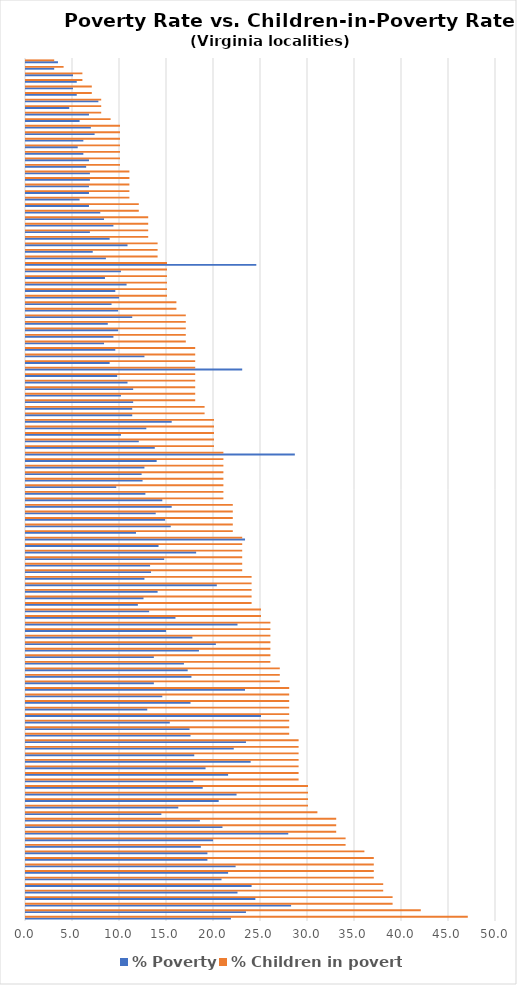
| Category | % Poverty | % Children in poverty |
|---|---|---|
| 0 | 21.8 | 47 |
| 1 | 23.4 | 42 |
| 2 | 28.2 | 39 |
| 3 | 24.4 | 39 |
| 4 | 22.5 | 38 |
| 5 | 24 | 38 |
| 6 | 20.8 | 37 |
| 7 | 21.5 | 37 |
| 8 | 22.3 | 37 |
| 9 | 19.3 | 37 |
| 10 | 19.3 | 36 |
| 11 | 18.6 | 34 |
| 12 | 19.9 | 34 |
| 13 | 27.9 | 33 |
| 14 | 20.9 | 33 |
| 15 | 18.5 | 33 |
| 16 | 14.4 | 31 |
| 17 | 16.2 | 30 |
| 18 | 20.5 | 30 |
| 19 | 22.4 | 30 |
| 20 | 18.8 | 30 |
| 21 | 17.8 | 29 |
| 22 | 21.5 | 29 |
| 23 | 19.1 | 29 |
| 24 | 23.9 | 29 |
| 25 | 17.9 | 29 |
| 26 | 22.1 | 29 |
| 27 | 23.4 | 29 |
| 28 | 17.5 | 28 |
| 29 | 17.4 | 28 |
| 30 | 15.3 | 28 |
| 31 | 25 | 28 |
| 32 | 12.9 | 28 |
| 33 | 17.5 | 28 |
| 34 | 14.5 | 28 |
| 35 | 23.3 | 28 |
| 36 | 13.6 | 27 |
| 37 | 17.6 | 27 |
| 38 | 17.2 | 27 |
| 39 | 16.8 | 26 |
| 40 | 13.6 | 26 |
| 41 | 18.4 | 26 |
| 42 | 20.2 | 26 |
| 43 | 17.7 | 26 |
| 44 | 14.9 | 26 |
| 45 | 22.5 | 26 |
| 46 | 15.9 | 25 |
| 47 | 13.1 | 25 |
| 48 | 11.9 | 24 |
| 49 | 12.5 | 24 |
| 50 | 14 | 24 |
| 51 | 20.3 | 24 |
| 52 | 12.6 | 24 |
| 53 | 13.3 | 23 |
| 54 | 13.2 | 23 |
| 55 | 14.7 | 23 |
| 56 | 18.1 | 23 |
| 57 | 14.1 | 23 |
| 58 | 23.3 | 23 |
| 59 | 11.7 | 22 |
| 60 | 15.4 | 22 |
| 61 | 14.8 | 22 |
| 62 | 13.8 | 22 |
| 63 | 15.5 | 22 |
| 64 | 14.5 | 21 |
| 65 | 12.7 | 21 |
| 66 | 9.6 | 21 |
| 67 | 12.4 | 21 |
| 68 | 12.3 | 21 |
| 69 | 12.6 | 21 |
| 70 | 13.9 | 21 |
| 71 | 28.6 | 21 |
| 72 | 13.7 | 20 |
| 73 | 12 | 20 |
| 74 | 10.1 | 20 |
| 75 | 12.8 | 20 |
| 76 | 15.5 | 20 |
| 77 | 11.3 | 19 |
| 78 | 11.3 | 19 |
| 79 | 11.4 | 18 |
| 80 | 10.1 | 18 |
| 81 | 11.4 | 18 |
| 82 | 10.8 | 18 |
| 83 | 9.7 | 18 |
| 84 | 23 | 18 |
| 85 | 8.9 | 18 |
| 86 | 12.6 | 18 |
| 87 | 9.5 | 18 |
| 88 | 8.3 | 17 |
| 89 | 9.3 | 17 |
| 90 | 9.8 | 17 |
| 91 | 8.7 | 17 |
| 92 | 11.3 | 17 |
| 93 | 9.8 | 16 |
| 94 | 9.1 | 16 |
| 95 | 9.9 | 15 |
| 96 | 9.5 | 15 |
| 97 | 10.7 | 15 |
| 98 | 8.4 | 15 |
| 99 | 10.1 | 15 |
| 100 | 24.5 | 15 |
| 101 | 8.5 | 14 |
| 102 | 7.1 | 14 |
| 103 | 10.8 | 14 |
| 104 | 8.9 | 13 |
| 105 | 6.8 | 13 |
| 106 | 9.3 | 13 |
| 107 | 8.3 | 13 |
| 108 | 7.9 | 12 |
| 109 | 6.7 | 12 |
| 110 | 5.7 | 11 |
| 111 | 6.7 | 11 |
| 112 | 6.7 | 11 |
| 113 | 6.8 | 11 |
| 114 | 6.8 | 11 |
| 115 | 6.4 | 10 |
| 116 | 6.7 | 10 |
| 117 | 6.1 | 10 |
| 118 | 5.5 | 10 |
| 119 | 6.1 | 10 |
| 120 | 7.3 | 10 |
| 121 | 6.9 | 10 |
| 122 | 5.7 | 9 |
| 123 | 6.7 | 8 |
| 124 | 4.6 | 8 |
| 125 | 7.7 | 8 |
| 126 | 5.4 | 7 |
| 127 | 5 | 7 |
| 128 | 5.4 | 6 |
| 129 | 5 | 6 |
| 130 | 3 | 4 |
| 131 | 3.4 | 3 |